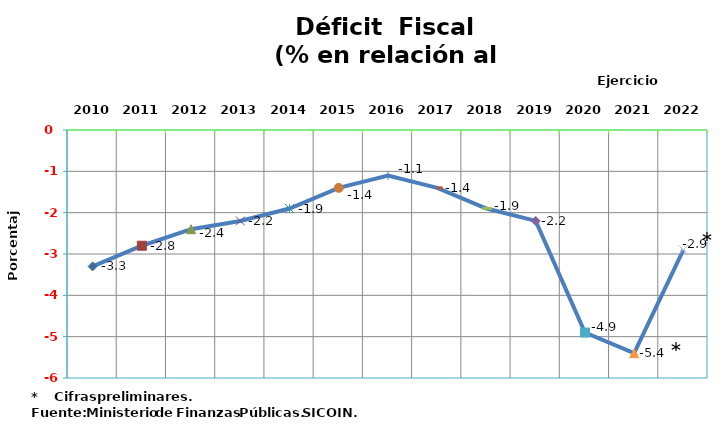
| Category | Series 0 |
|---|---|
| 2010 | -3.3 |
| 2011 | -2.8 |
| 2012 | -2.4 |
| 2013 | -2.2 |
| 2014 | -1.9 |
| 2015 | -1.4 |
| 2016 | -1.1 |
| 2017 | -1.4 |
| 2018 | -1.9 |
| 2019 | -2.2 |
| 2020 | -4.9 |
| 2021 | -5.4 |
| 2022 | -2.9 |